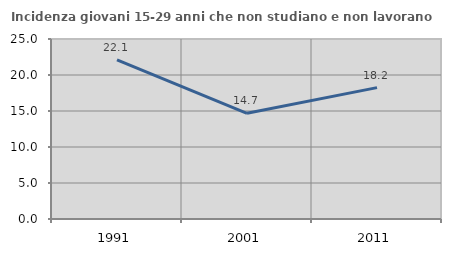
| Category | Incidenza giovani 15-29 anni che non studiano e non lavorano  |
|---|---|
| 1991.0 | 22.098 |
| 2001.0 | 14.676 |
| 2011.0 | 18.248 |